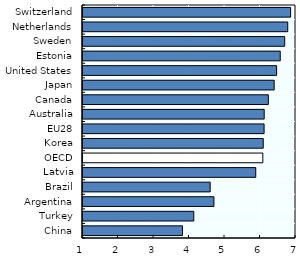
| Category | 2017-2018 |
|---|---|
| China | 3.803 |
| Turkey | 4.12 |
| Argentina | 4.688 |
| Brazil | 4.582 |
| Latvia | 5.866 |
| OECD | 6.066 |
| Korea | 6.077 |
| EU28 | 6.102 |
| Australia | 6.104 |
| Canada | 6.221 |
| Japan | 6.385 |
| United States | 6.454 |
| Estonia | 6.556 |
| Sweden | 6.681 |
| Netherlands | 6.767 |
| Switzerland | 6.848 |